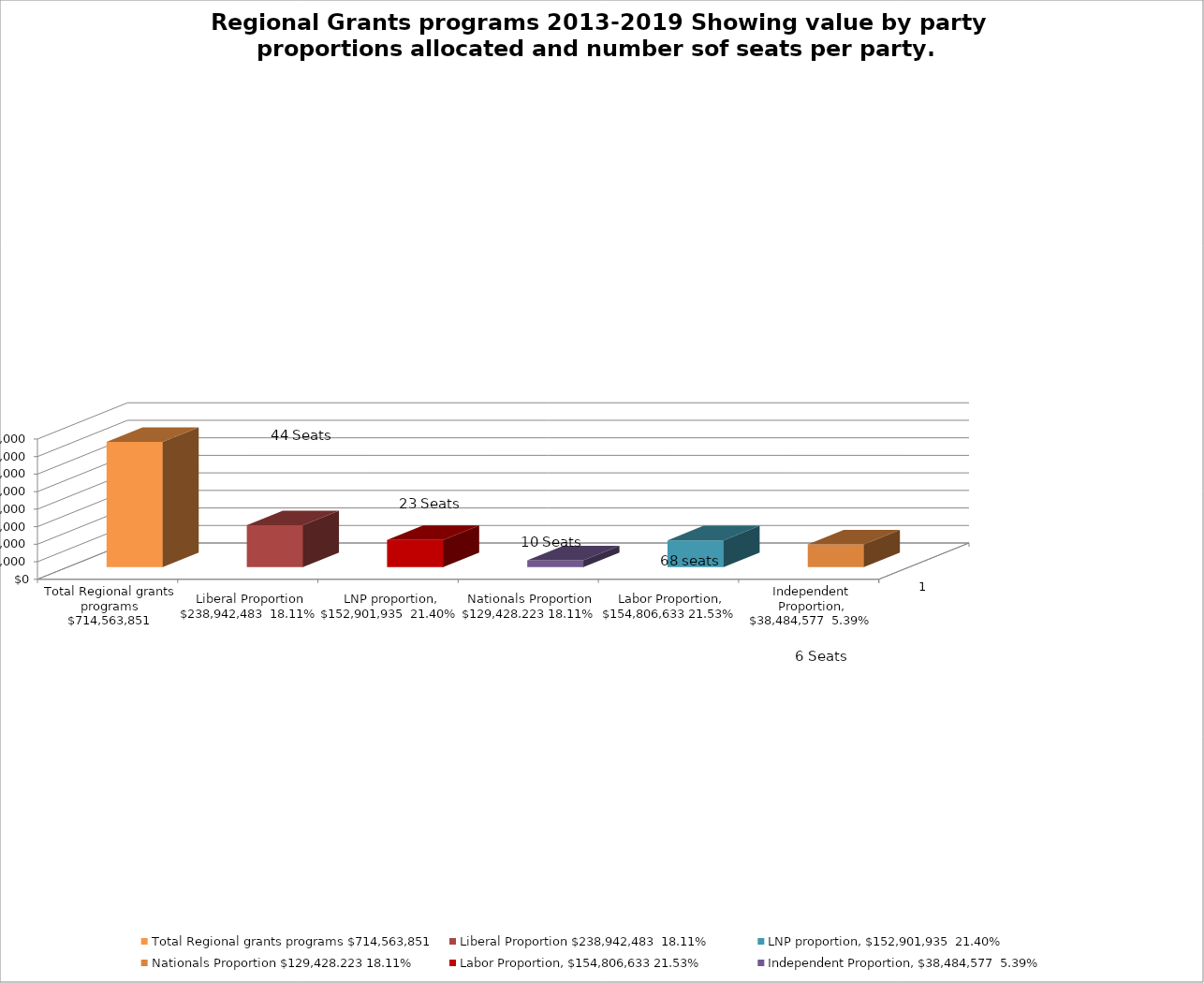
| Category | Total Regional grants programs $714,563,851 | Liberal Proportion $238,942,483  18.11% | LNP proportion, $152,901,935  21.40% | Nationals Proportion $129,428.223 18.11% | Labor Proportion, $154,806,633 21.53% | Independent Proportion, $38,484,577  5.39% |
|---|---|---|---|---|---|---|
| 0 | 714563851 | 238942483 | 152901935 | 129428223 | 154806633 | 38484577 |